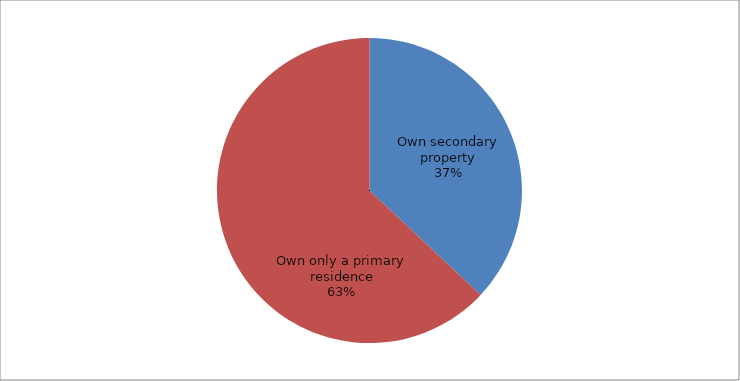
| Category | Series 0 |
|---|---|
| Own secondary property | 37 |
| Own only a primary residence | 63 |